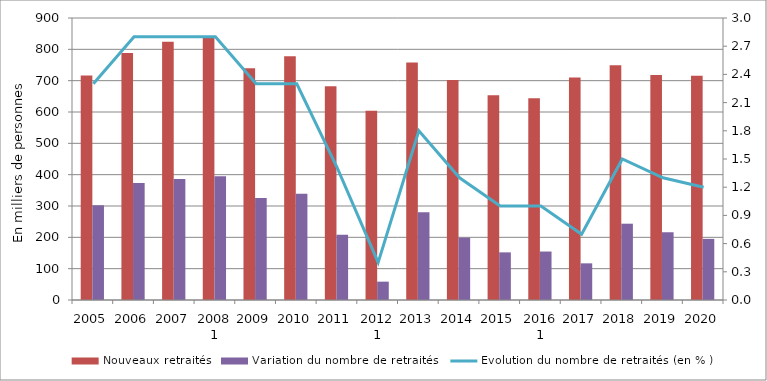
| Category | Nouveaux retraités | Variation du nombre de retraités  |
|---|---|---|
| 2005 | 716.315 | 302.192 |
| 2006 | 788.515 | 373.406 |
| 2007 | 824.296 | 386.112 |
| 2008 1 | 842.725 | 395.262 |
| 2009 | 739.341 | 325.503 |
| 2010 | 777.725 | 338.744 |
| 2011 | 681.785 | 208.626 |
| 2012 1 | 604.165 | 58.535 |
| 2013 | 758.257 | 280.317 |
| 2014 | 702.307 | 198.932 |
| 2015 | 653.253 | 152.038 |
| 2016 1 | 643.7 | 154.7 |
| 2017 | 710.3 | 117 |
| 2018 | 749.5 | 243.5 |
| 2019 | 718.3 | 216.4 |
| 2020 | 715.6 | 195.1 |